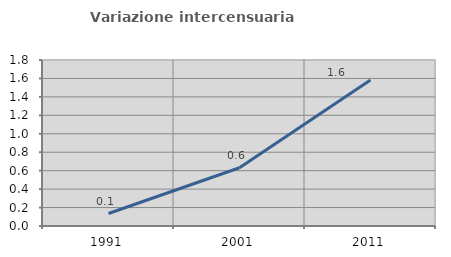
| Category | Variazione intercensuaria annua |
|---|---|
| 1991.0 | 0.135 |
| 2001.0 | 0.632 |
| 2011.0 | 1.584 |